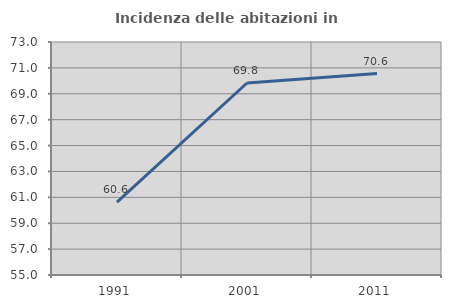
| Category | Incidenza delle abitazioni in proprietà  |
|---|---|
| 1991.0 | 60.631 |
| 2001.0 | 69.833 |
| 2011.0 | 70.561 |